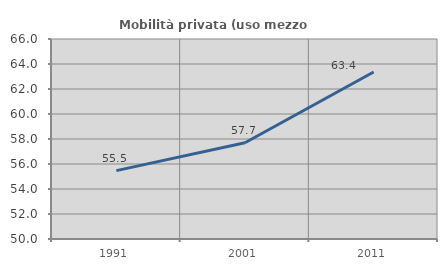
| Category | Mobilità privata (uso mezzo privato) |
|---|---|
| 1991.0 | 55.468 |
| 2001.0 | 57.7 |
| 2011.0 | 63.355 |